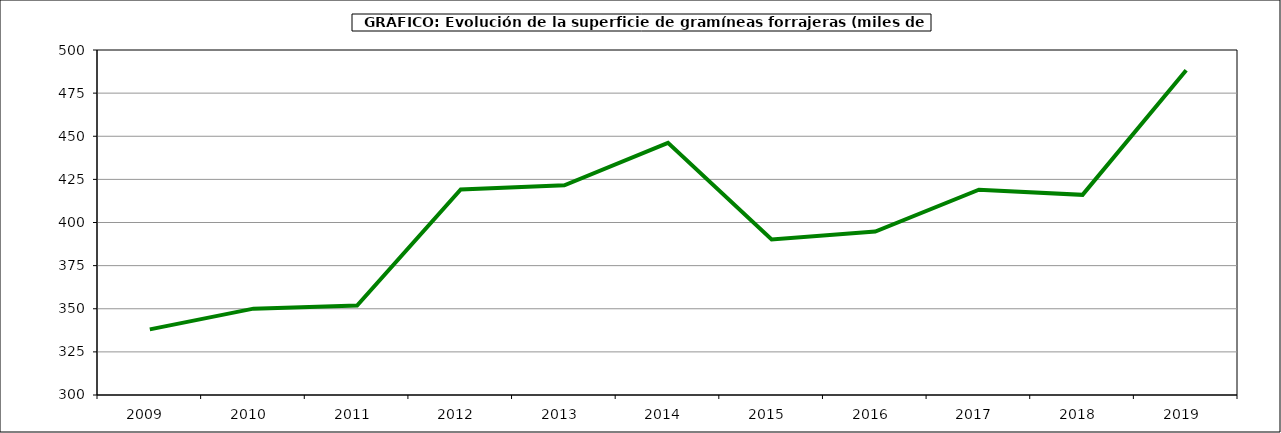
| Category | Superficie |
|---|---|
| 2009.0 | 338.053 |
| 2010.0 | 350.058 |
| 2011.0 | 351.87 |
| 2012.0 | 419.197 |
| 2013.0 | 421.523 |
| 2014.0 | 446.163 |
| 2015.0 | 390.211 |
| 2016.0 | 394.792 |
| 2017.0 | 418.976 |
| 2018.0 | 416.034 |
| 2019.0 | 488.269 |